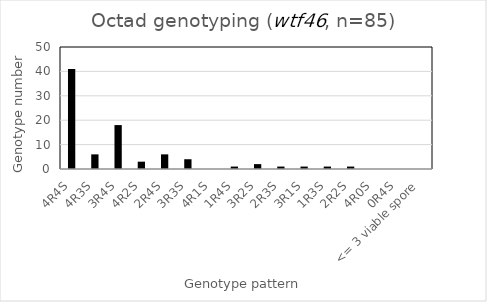
| Category | Number |
|---|---|
| 4R4S | 41 |
| 4R3S | 6 |
| 3R4S | 18 |
| 4R2S | 3 |
| 2R4S | 6 |
| 3R3S | 4 |
| 4R1S | 0 |
| 1R4S | 1 |
| 3R2S | 2 |
| 2R3S | 1 |
| 3R1S | 1 |
| 1R3S | 1 |
| 2R2S | 1 |
| 4R0S | 0 |
| 0R4S | 0 |
| <= 3 viable spore | 0 |